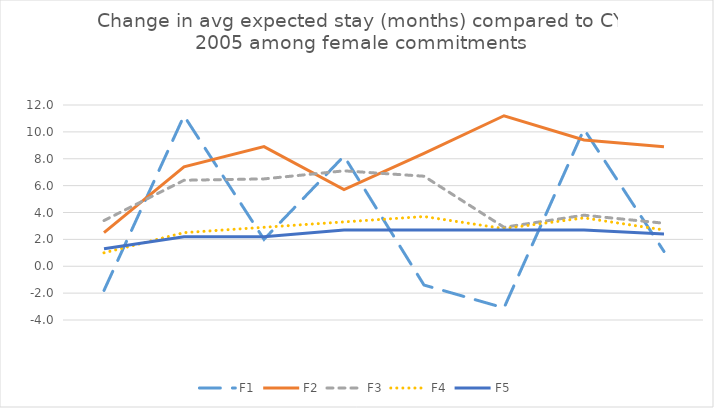
| Category | F1 | F2 | F3 | F4 | F5 |
|---|---|---|---|---|---|
| CY 2007 | -1.8 | 2.5 | 3.4 | 1 | 1.3 |
| CY 2008 | 11.2 | 7.4 | 6.4 | 2.5 | 2.2 |
| CY 2009 | 2 | 8.9 | 6.5 | 2.9 | 2.2 |
| CY 2010 | 8.2 | 5.7 | 7.1 | 3.3 | 2.7 |
| CY 2011 | -1.4 | 8.4 | 6.7 | 3.7 | 2.7 |
| CY 2013 | -3.1 | 11.2 | 2.9 | 2.8 | 2.7 |
| CY 2014 | 10.2 | 9.4 | 3.8 | 3.6 | 2.7 |
| CY 2015 | 1.1 | 8.9 | 3.2 | 2.7 | 2.4 |